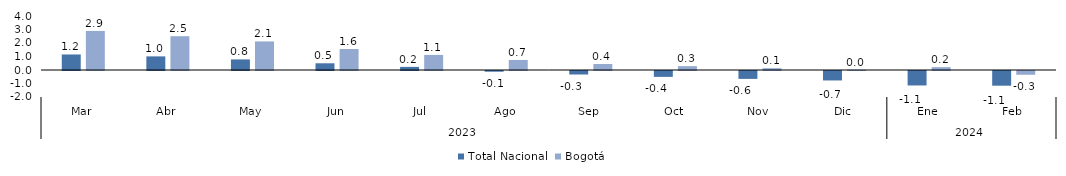
| Category | Total Nacional | Bogotá |
|---|---|---|
| 0 | 1.15 | 2.894 |
| 1 | 1.008 | 2.503 |
| 2 | 0.783 | 2.116 |
| 3 | 0.497 | 1.555 |
| 4 | 0.231 | 1.116 |
| 5 | -0.053 | 0.745 |
| 6 | -0.259 | 0.445 |
| 7 | -0.435 | 0.286 |
| 8 | -0.584 | 0.135 |
| 9 | -0.701 | 0.022 |
| 10 | -1.072 | 0.21 |
| 11 | -1.088 | -0.281 |